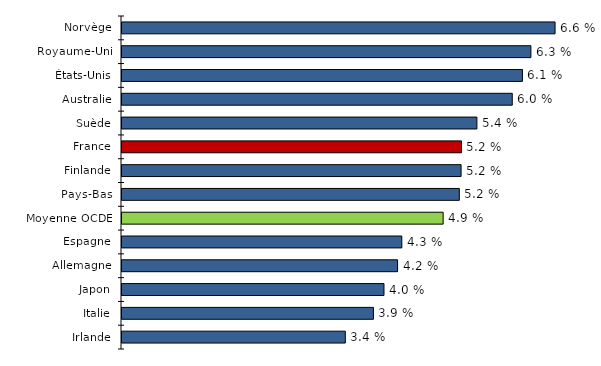
| Category | Series 0 |
|---|---|
| Irlande | 3.421 |
| Italie | 3.851 |
| Japon | 4.013 |
| Allemagne | 4.221 |
| Espagne | 4.286 |
| Moyenne OCDE | 4.919 |
| Pays-Bas | 5.167 |
| Finlande | 5.194 |
| France | 5.2 |
| Suède | 5.436 |
| Australie | 5.978 |
| États-Unis | 6.134 |
| Royaume-Uni | 6.263 |
| Norvège | 6.633 |